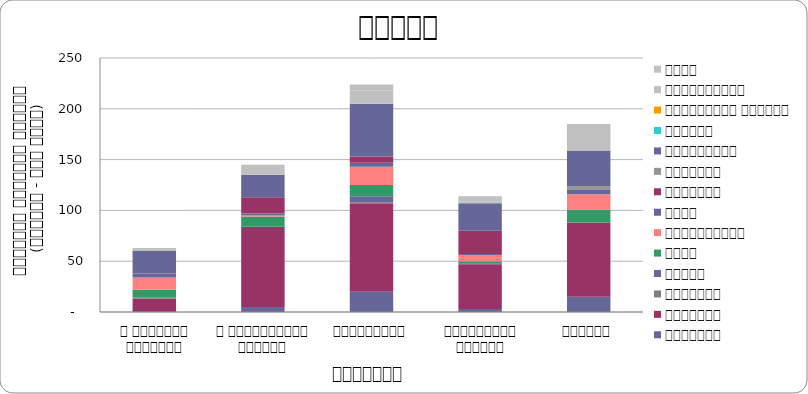
| Category | सुरक्षा | राजनीति | आन्दोलन | न्याय | शासन | अर्थतन्त्र | समाज | कुटनीति | वातावरण | स्वास्थ्य  | शिक्षा | प्राकृतिक प्रकोप | भ्रष्टाचार | अन्य |
|---|---|---|---|---|---|---|---|---|---|---|---|---|---|---|
| द हिमालयन टाइम्स् | 1 | 12 | 1 | 0 | 8 | 12 | 4 | 0 | 0 | 22 | 0 | 0 | 0 | 3 |
| द काठमाण्डौं पोस्ट् | 5 | 79 | 0 | 0 | 10 | 1 | 2 | 16 | 0 | 22 | 0 | 0 | 10 | 0 |
| कान्तिपुर | 20 | 87 | 1 | 6 | 11 | 18 | 4 | 6 | 0 | 52 | 0 | 0 | 13 | 6 |
| अन्नपूर्ण पोस्ट् | 3 | 44 | 0 | 1 | 2 | 6 | 1 | 23 | 0 | 27 | 0 | 0 | 2 | 5 |
| नागरिक | 15 | 73 | 0 | 0 | 13 | 15 | 4 | 0 | 4 | 35 | 0 | 0 | 26 | 0 |